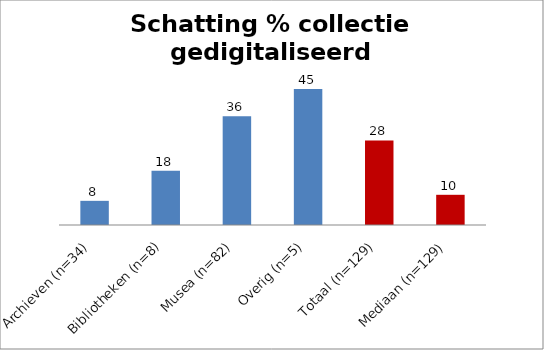
| Category | Series 0 |
|---|---|
| Archieven (n=34) | 8 |
| Bibliotheken (n=8) | 18 |
| Musea (n=82) | 36 |
| Overig (n=5) | 45 |
| Totaal (n=129) | 28 |
| Mediaan (n=129) | 10 |